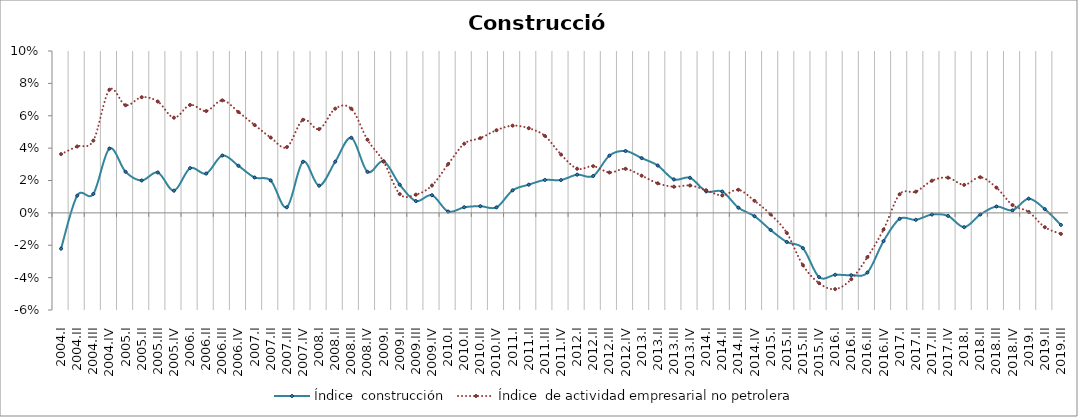
| Category | Índice  construcción | Índice  de actividad empresarial no petrolera |
|---|---|---|
| 2004.I | -0.022 | 0.036 |
| 2004.II | 0.011 | 0.041 |
| 2004.III | 0.012 | 0.045 |
| 2004.IV | 0.04 | 0.076 |
| 2005.I | 0.025 | 0.066 |
| 2005.II | 0.02 | 0.071 |
| 2005.III | 0.025 | 0.069 |
| 2005.IV | 0.014 | 0.059 |
| 2006.I | 0.028 | 0.067 |
| 2006.II | 0.024 | 0.063 |
| 2006.III | 0.035 | 0.07 |
| 2006.IV | 0.029 | 0.062 |
| 2007.I | 0.022 | 0.054 |
| 2007.II | 0.02 | 0.047 |
| 2007.III | 0.003 | 0.041 |
| 2007.IV | 0.032 | 0.057 |
| 2008.I | 0.017 | 0.052 |
| 2008.II | 0.032 | 0.064 |
| 2008.III | 0.046 | 0.064 |
| 2008.IV | 0.025 | 0.045 |
| 2009.I | 0.032 | 0.032 |
| 2009.II | 0.017 | 0.012 |
| 2009.III | 0.007 | 0.011 |
| 2009.IV | 0.011 | 0.017 |
| 2010.I | 0.001 | 0.03 |
| 2010.II | 0.003 | 0.043 |
| 2010.III | 0.004 | 0.046 |
| 2010.IV | 0.003 | 0.051 |
| 2011.I | 0.014 | 0.054 |
| 2011.II | 0.017 | 0.052 |
| 2011.III | 0.02 | 0.048 |
| 2011.IV | 0.02 | 0.036 |
| 2012.I | 0.024 | 0.027 |
| 2012.II | 0.023 | 0.029 |
| 2012.III | 0.035 | 0.025 |
| 2012.IV | 0.038 | 0.027 |
| 2013.I | 0.034 | 0.023 |
| 2013.II | 0.029 | 0.018 |
| 2013.III | 0.021 | 0.016 |
| 2013.IV | 0.022 | 0.017 |
| 2014.I | 0.013 | 0.014 |
| 2014.II | 0.013 | 0.011 |
| 2014.III | 0.003 | 0.014 |
| 2014.IV | -0.002 | 0.007 |
| 2015.I | -0.011 | -0.001 |
| 2015.II | -0.018 | -0.012 |
| 2015.III | -0.022 | -0.032 |
| 2015.IV | -0.04 | -0.043 |
| 2016.I | -0.038 | -0.047 |
| 2016.II | -0.038 | -0.041 |
| 2016.III | -0.037 | -0.027 |
| 2016.IV | -0.017 | -0.01 |
| 2017.I | -0.004 | 0.012 |
| 2017.II | -0.004 | 0.013 |
| 2017.III | -0.001 | 0.02 |
| 2017.IV | -0.002 | 0.022 |
| 2018.I | -0.009 | 0.017 |
| 2018.II | -0.001 | 0.022 |
| 2018.III | 0.004 | 0.016 |
| 2018.IV | 0.002 | 0.005 |
| 2019.I | 0.009 | 0.001 |
| 2019.II | 0.002 | -0.009 |
| 2019.III | -0.007 | -0.013 |